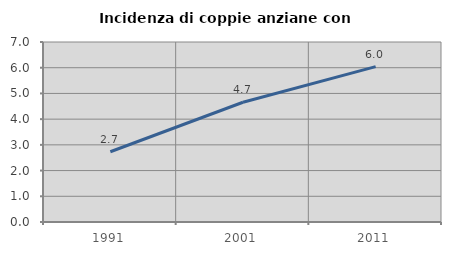
| Category | Incidenza di coppie anziane con figli |
|---|---|
| 1991.0 | 2.733 |
| 2001.0 | 4.657 |
| 2011.0 | 6.043 |